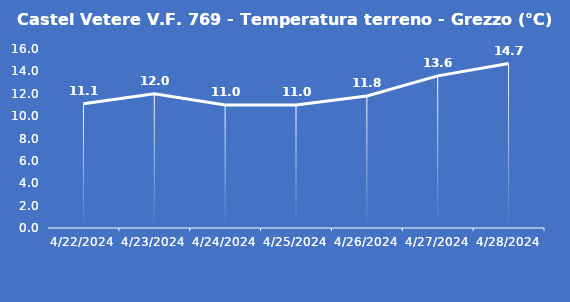
| Category | Castel Vetere V.F. 769 - Temperatura terreno - Grezzo (°C) |
|---|---|
| 4/22/24 | 11.1 |
| 4/23/24 | 12 |
| 4/24/24 | 11 |
| 4/25/24 | 11 |
| 4/26/24 | 11.8 |
| 4/27/24 | 13.6 |
| 4/28/24 | 14.7 |